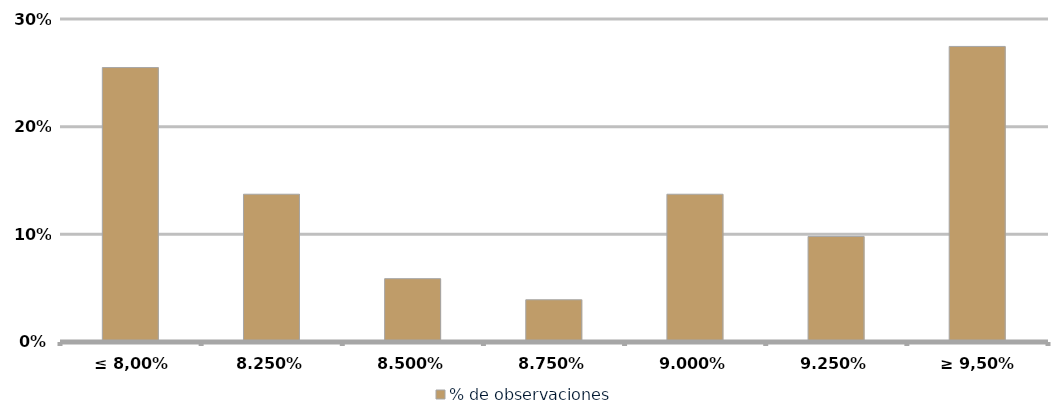
| Category | % de observaciones  |
|---|---|
| ≤ 8,00% | 0.255 |
| 8,25% | 0.137 |
| 8,50% | 0.059 |
| 8,75% | 0.039 |
| 9,00% | 0.137 |
| 9,25% | 0.098 |
| ≥ 9,50% | 0.275 |